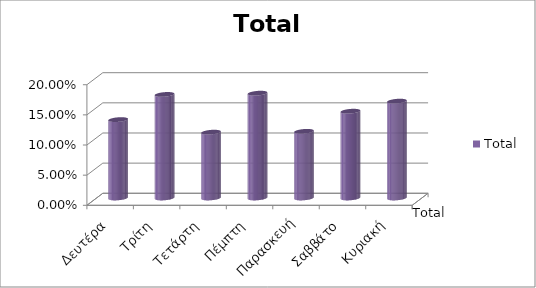
| Category | Total |
|---|---|
| Δευτέρα | 0.13 |
| Τρίτη | 0.172 |
| Τετάρτη | 0.109 |
| Πέμπτη | 0.174 |
| Παρασκευή | 0.111 |
| Σαββάτο | 0.144 |
| Κυριακή | 0.161 |